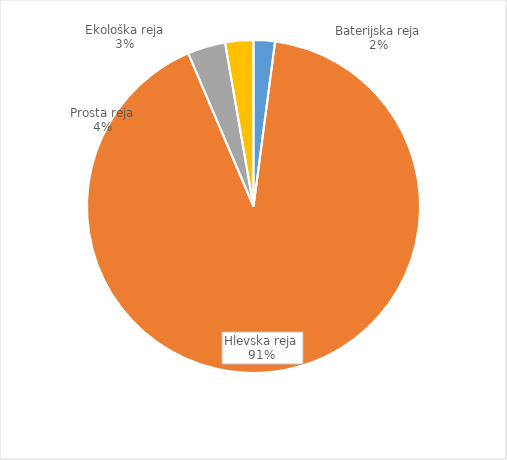
| Category | Količina kosov jajc |
|---|---|
| Baterijska reja | 64803 |
| Hlevska reja | 2858992 |
| Prosta reja | 114865 |
| Ekološka reja | 85520 |